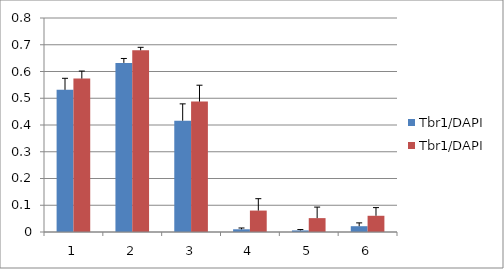
| Category | Tbr1/DAPI |
|---|---|
| 0 | 0.574 |
| 1 | 0.679 |
| 2 | 0.487 |
| 3 | 0.08 |
| 4 | 0.052 |
| 5 | 0.061 |